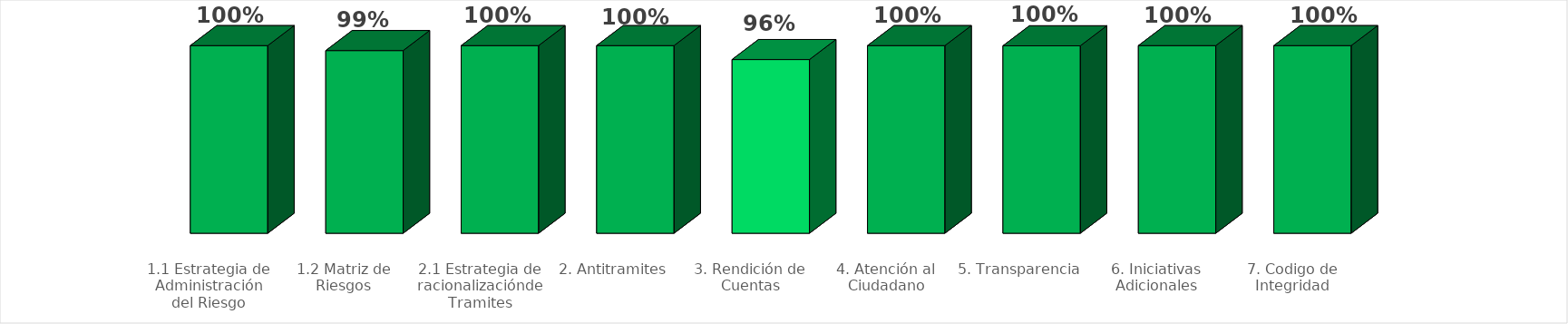
| Category | Porcentaje de avance cumplimiento por componente del PAAC 2019 |
|---|---|
| 1.1 Estrategia de Administración del Riesgo | 1 |
| 1.2 Matriz de Riesgos | 0.987 |
| 2.1 Estrategia de racionalizaciónde Tramites | 1 |
| 2. Antitramites | 1 |
| 3. Rendición de Cuentas | 0.963 |
| 4. Atención al Ciudadano | 1 |
| 5. Transparencia | 1 |
| 6. Iniciativas Adicionales | 1 |
| 7. Codigo de Integridad | 1 |